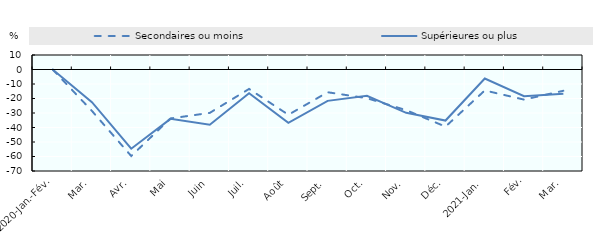
| Category | Secondaires ou moins | Supérieures ou plus |
|---|---|---|
| 2020-Jan.-Fév. | 0 | 0 |
| Mar. | -28.554 | -22.515 |
| Avr. | -59.669 | -54.635 |
| Mai | -33.765 | -34.033 |
| Juin | -29.914 | -38.047 |
| Juil. | -13.396 | -16.399 |
| Août | -31.223 | -36.754 |
| Sept. | -15.687 | -21.618 |
| Oct. | -19.789 | -18.142 |
| Nov. | -28.046 | -29.898 |
| Déc. | -39.398 | -35.207 |
| 2021-Jan. | -14.459 | -6.21 |
| Fév. | -20.764 | -18.428 |
| Mar. | -14.669 | -16.666 |